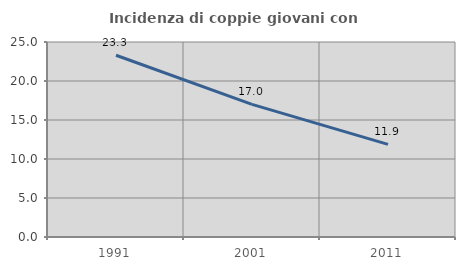
| Category | Incidenza di coppie giovani con figli |
|---|---|
| 1991.0 | 23.305 |
| 2001.0 | 17.005 |
| 2011.0 | 11.876 |